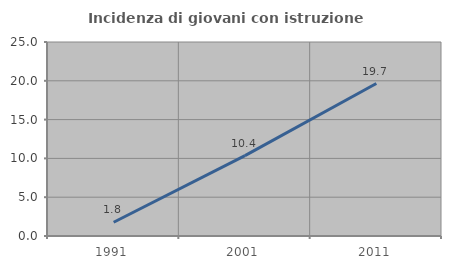
| Category | Incidenza di giovani con istruzione universitaria |
|---|---|
| 1991.0 | 1.775 |
| 2001.0 | 10.359 |
| 2011.0 | 19.651 |